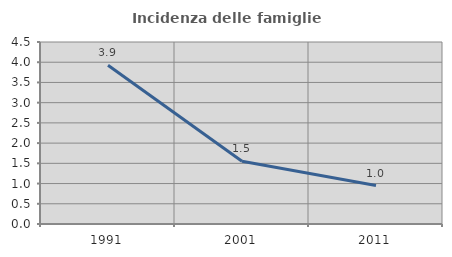
| Category | Incidenza delle famiglie numerose |
|---|---|
| 1991.0 | 3.926 |
| 2001.0 | 1.549 |
| 2011.0 | 0.95 |